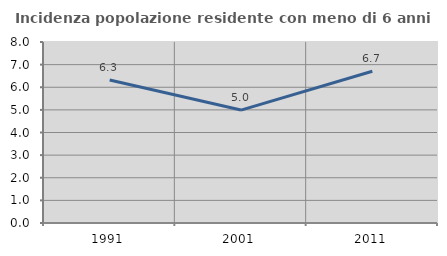
| Category | Incidenza popolazione residente con meno di 6 anni |
|---|---|
| 1991.0 | 6.321 |
| 2001.0 | 4.991 |
| 2011.0 | 6.709 |